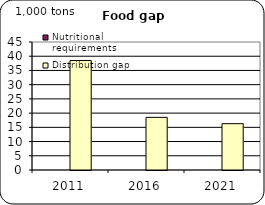
| Category | Nutritional requirements | Distribution gap |
|---|---|---|
| 2011.0 | 0 | 38.492 |
| 2016.0 | 0 | 18.512 |
| 2021.0 | 0 | 16.287 |